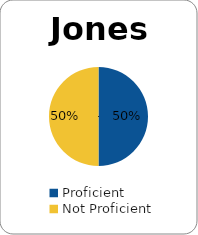
| Category | Series 0 |
|---|---|
| Proficient | 0.5 |
| Not Proficient | 0.5 |